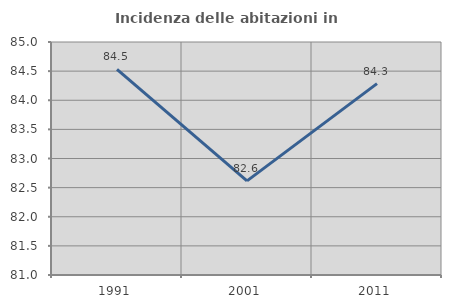
| Category | Incidenza delle abitazioni in proprietà  |
|---|---|
| 1991.0 | 84.53 |
| 2001.0 | 82.616 |
| 2011.0 | 84.286 |